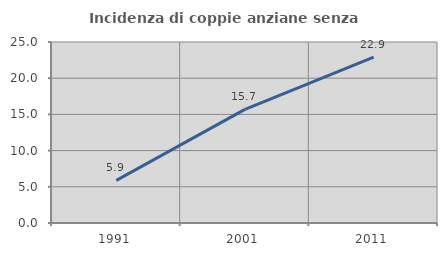
| Category | Incidenza di coppie anziane senza figli  |
|---|---|
| 1991.0 | 5.882 |
| 2001.0 | 15.686 |
| 2011.0 | 22.917 |